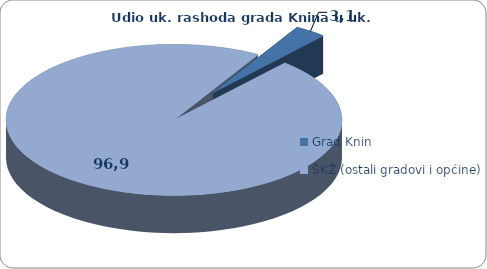
| Category | Series 0 | Series 1 |
|---|---|---|
| Grad Knin | 216349.41 | 3.052 |
| ŠKŽ (ostali gradovi i općine) | 6872857.633 | 96.948 |